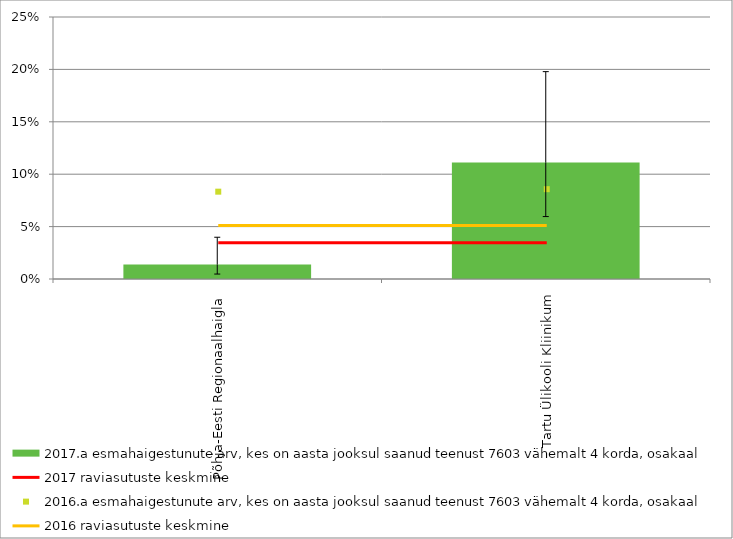
| Category | 2017.a esmahaigestunute arv, kes on aasta jooksul saanud teenust 7603 vähemalt 4 korda, osakaal |
|---|---|
| Põhja-Eesti Regionaalhaigla | 0.014 |
| Tartu Ülikooli Kliinikum | 0.111 |